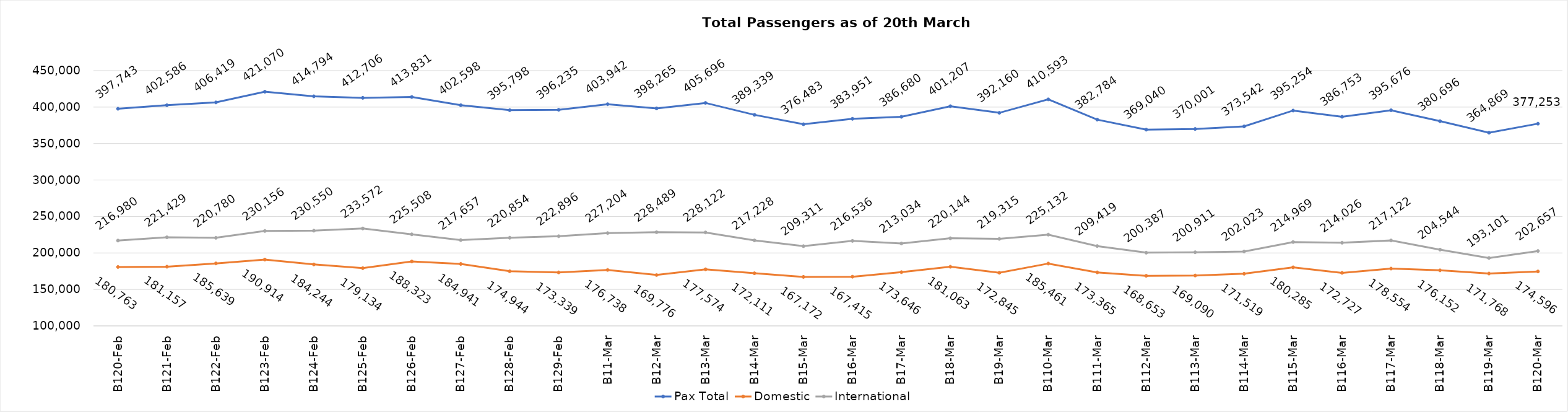
| Category | Pax Total | Domestic | International |
|---|---|---|---|
| 2024-02-20 | 397743 | 180763 | 216980 |
| 2024-02-21 | 402586 | 181157 | 221429 |
| 2024-02-22 | 406419 | 185639 | 220780 |
| 2024-02-23 | 421070 | 190914 | 230156 |
| 2024-02-24 | 414794 | 184244 | 230550 |
| 2024-02-25 | 412706 | 179134 | 233572 |
| 2024-02-26 | 413831 | 188323 | 225508 |
| 2024-02-27 | 402598 | 184941 | 217657 |
| 2024-02-28 | 395798 | 174944 | 220854 |
| 2024-02-29 | 396235 | 173339 | 222896 |
| 2024-03-01 | 403942 | 176738 | 227204 |
| 2024-03-02 | 398265 | 169776 | 228489 |
| 2024-03-03 | 405696 | 177574 | 228122 |
| 2024-03-04 | 389339 | 172111 | 217228 |
| 2024-03-05 | 376483 | 167172 | 209311 |
| 2024-03-06 | 383951 | 167415 | 216536 |
| 2024-03-07 | 386680 | 173646 | 213034 |
| 2024-03-08 | 401207 | 181063 | 220144 |
| 2024-03-09 | 392160 | 172845 | 219315 |
| 2024-03-10 | 410593 | 185461 | 225132 |
| 2024-03-11 | 382784 | 173365 | 209419 |
| 2024-03-12 | 369040 | 168653 | 200387 |
| 2024-03-13 | 370001 | 169090 | 200911 |
| 2024-03-14 | 373542 | 171519 | 202023 |
| 2024-03-15 | 395254 | 180285 | 214969 |
| 2024-03-16 | 386753 | 172727 | 214026 |
| 2024-03-17 | 395676 | 178554 | 217122 |
| 2024-03-18 | 380696 | 176152 | 204544 |
| 2024-03-19 | 364869 | 171768 | 193101 |
| 2024-03-20 | 377253 | 174596 | 202657 |